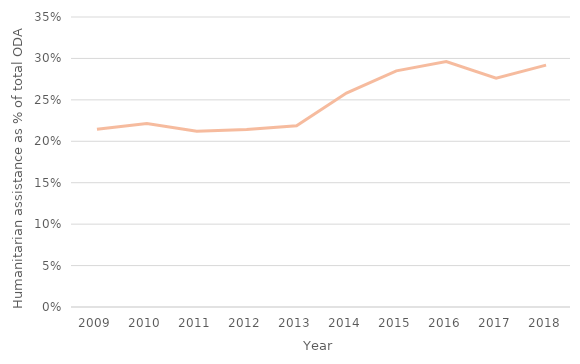
| Category | Series 1 |
|---|---|
| 2009.0 | 0.215 |
| 2010.0 | 0.221 |
| 2011.0 | 0.212 |
| 2012.0 | 0.214 |
| 2013.0 | 0.219 |
| 2014.0 | 0.258 |
| 2015.0 | 0.285 |
| 2016.0 | 0.296 |
| 2017.0 | 0.276 |
| 2018.0 | 0.292 |